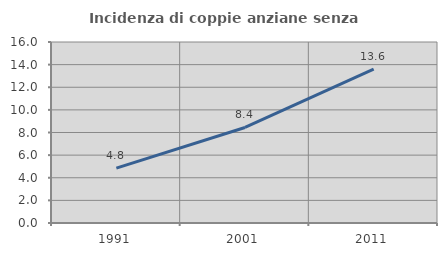
| Category | Incidenza di coppie anziane senza figli  |
|---|---|
| 1991.0 | 4.847 |
| 2001.0 | 8.445 |
| 2011.0 | 13.609 |